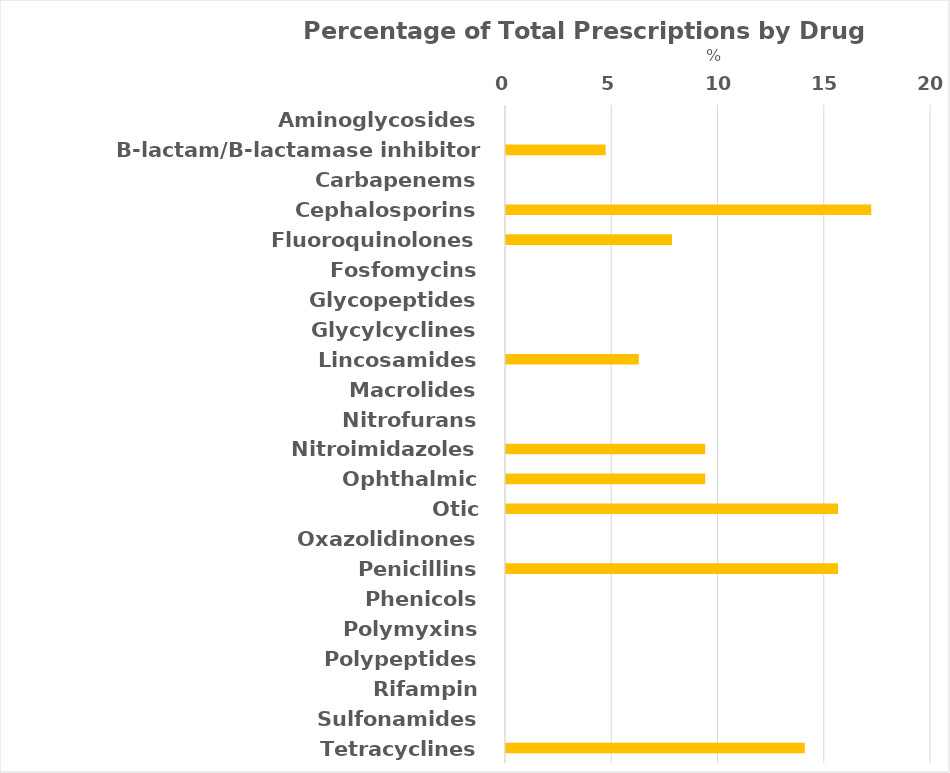
| Category | Series 0 |
|---|---|
| Aminoglycosides | 0 |
| B-lactam/B-lactamase inhibitor combination | 4.688 |
| Carbapenems | 0 |
| Cephalosporins | 17.188 |
| Fluoroquinolones | 7.812 |
| Fosfomycins | 0 |
| Glycopeptides | 0 |
| Glycylcyclines | 0 |
| Lincosamides | 6.25 |
| Macrolides | 0 |
| Nitrofurans | 0 |
| Nitroimidazoles | 9.375 |
| Ophthalmic | 9.375 |
| Otic | 15.625 |
| Oxazolidinones | 0 |
| Penicillins | 15.625 |
| Phenicols | 0 |
| Polymyxins | 0 |
| Polypeptides | 0 |
| Rifampin | 0 |
| Sulfonamides | 0 |
| Tetracyclines | 14.062 |